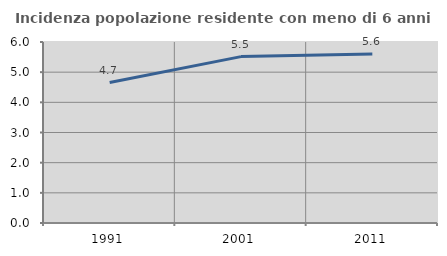
| Category | Incidenza popolazione residente con meno di 6 anni |
|---|---|
| 1991.0 | 4.657 |
| 2001.0 | 5.515 |
| 2011.0 | 5.601 |